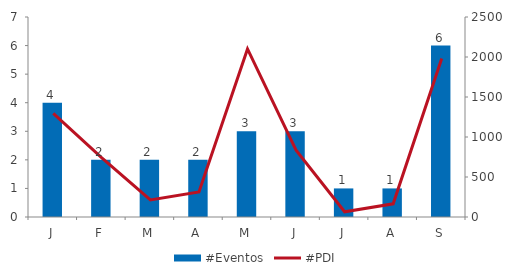
| Category | #Eventos |
|---|---|
| J | 4 |
| F | 2 |
| M | 2 |
| A | 2 |
| M | 3 |
| J | 3 |
| J | 1 |
| A | 1 |
| S | 6 |